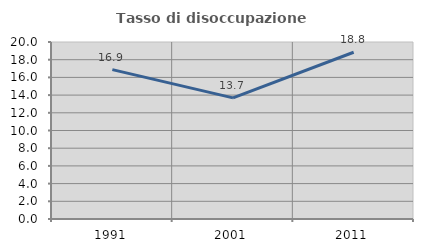
| Category | Tasso di disoccupazione giovanile  |
|---|---|
| 1991.0 | 16.875 |
| 2001.0 | 13.684 |
| 2011.0 | 18.841 |